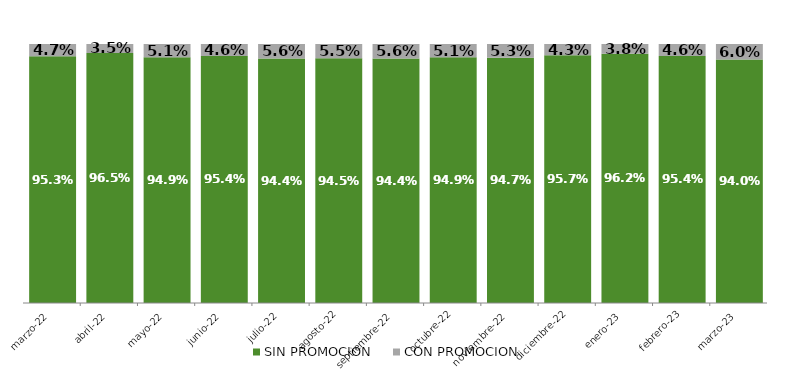
| Category | SIN PROMOCION   | CON PROMOCION   |
|---|---|---|
| 2022-03-01 | 0.953 | 0.047 |
| 2022-04-01 | 0.965 | 0.035 |
| 2022-05-01 | 0.949 | 0.051 |
| 2022-06-01 | 0.954 | 0.046 |
| 2022-07-01 | 0.944 | 0.056 |
| 2022-08-01 | 0.945 | 0.055 |
| 2022-09-01 | 0.944 | 0.056 |
| 2022-10-01 | 0.949 | 0.051 |
| 2022-11-01 | 0.947 | 0.053 |
| 2022-12-01 | 0.957 | 0.043 |
| 2023-01-01 | 0.962 | 0.038 |
| 2023-02-01 | 0.954 | 0.046 |
| 2023-03-01 | 0.94 | 0.06 |